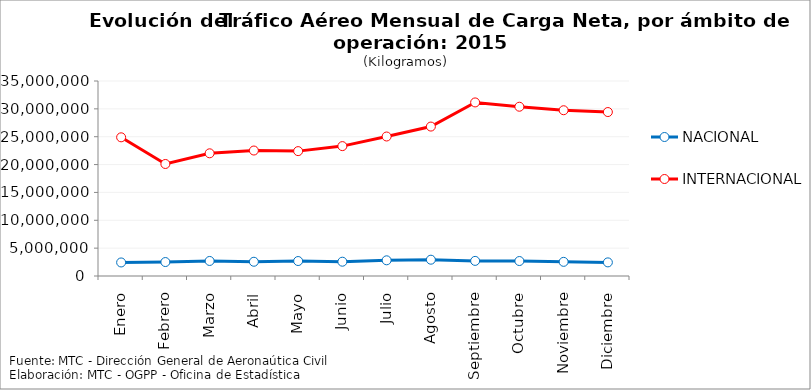
| Category | NACIONAL | INTERNACIONAL |
|---|---|---|
| Enero | 2431047.67 | 24891807 |
| Febrero | 2505224.48 | 20105856 |
| Marzo | 2699960 | 22021270 |
| Abril | 2556180.2 | 22521692 |
| Mayo | 2686708.813 | 22414027 |
| Junio | 2565091.68 | 23313394 |
| Julio | 2817430.46 | 25037772 |
| Agosto | 2926256.69 | 26821822 |
| Septiembre | 2712726.25 | 31153136 |
| Octubre | 2688313.85 | 30381576 |
| Noviembre | 2539282.42 | 29751951 |
| Diciembre | 2444929.54 | 29428050 |